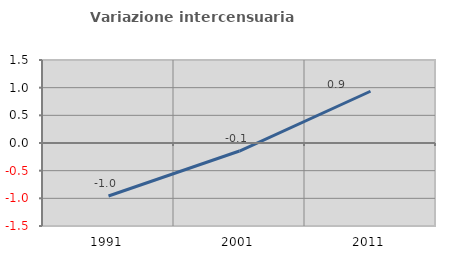
| Category | Variazione intercensuaria annua |
|---|---|
| 1991.0 | -0.957 |
| 2001.0 | -0.145 |
| 2011.0 | 0.935 |